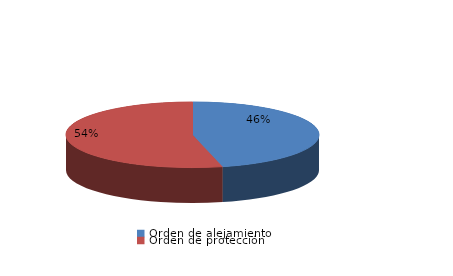
| Category | Series 0 |
|---|---|
| Orden de alejamiento | 140 |
| Orden de protección | 163 |